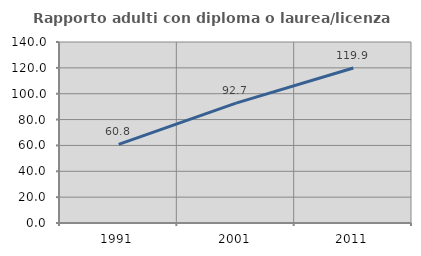
| Category | Rapporto adulti con diploma o laurea/licenza media  |
|---|---|
| 1991.0 | 60.802 |
| 2001.0 | 92.699 |
| 2011.0 | 119.907 |